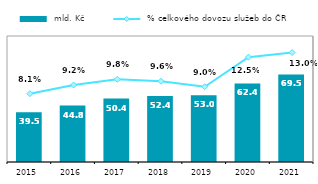
| Category |  mld. Kč |
|---|---|
| 2015.0 | 39.517 |
| 2016.0 | 44.807 |
| 2017.0 | 50.389 |
| 2018.0 | 52.446 |
| 2019.0 | 53.04 |
| 2020.0 | 62.374 |
| 2021.0 | 69.512 |